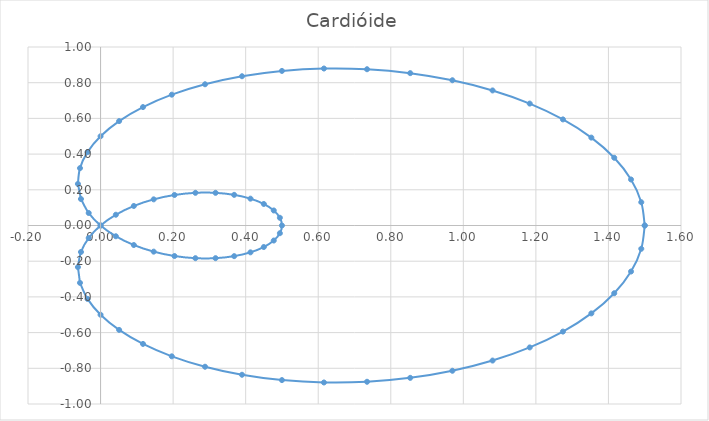
| Category | Series 0 |
|---|---|
| 1.5 | 0 |
| 1.4905012255519767 | 0.13 |
| 1.4622501868990583 | 0.258 |
| 1.4159756150367535 | 0.379 |
| 1.3528685319524434 | 0.492 |
| 1.2745476983615946 | 0.594 |
| 1.1830127018922196 | 0.683 |
| 1.0805860938073304 | 0.757 |
| 0.9698463103929541 | 0.814 |
| 0.8535533905932737 | 0.854 |
| 0.7345697160098045 | 0.875 |
| 0.6157781465126887 | 0.879 |
| 0.5000000000000001 | 0.866 |
| 0.38991532602708007 | 0.836 |
| 0.2879878501033455 | 0.791 |
| 0.19639682065904104 | 0.733 |
| 0.11697777844051103 | 0.663 |
| 0.05117399486772503 | 0.585 |
| 3.0628711372715506e-17 | 0.5 |
| -0.035981747879933135 | 0.411 |
| -0.05667039922641936 | 0.321 |
| -0.0624222244434797 | 0.233 |
| -0.05403229322232339 | 0.148 |
| -0.032702935713619416 | 0.07 |
| -1.110223024625156e-16 | 0 |
| 0.04220171016164241 | -0.06 |
| 0.0917821063232652 | -0.109 |
| 0.14644660940672619 | -0.146 |
| 0.203801867273976 | -0.171 |
| 0.2614340495183382 | -0.183 |
| 0.31698729810778076 | -0.183 |
| 0.36823991132494466 | -0.172 |
| 0.41317591116653474 | -0.15 |
| 0.45004978874768503 | -0.121 |
| 0.4774424338868501 | -0.084 |
| 0.4943065274602313 | -0.043 |
| 0.5 | 0 |
| 0.4943065274602313 | 0.043 |
| 0.4774424338868501 | 0.084 |
| 0.45004978874768536 | 0.121 |
| 0.4131759111665349 | 0.15 |
| 0.36823991132494477 | 0.172 |
| 0.3169872981077806 | 0.183 |
| 0.2614340495183387 | 0.183 |
| 0.20380186727397614 | 0.171 |
| 0.14644660940672638 | 0.146 |
| 0.09178210632326528 | 0.109 |
| 0.04220171016164277 | 0.06 |
| 2.220446049250315e-16 | 0 |
| -0.03270293571361921 | -0.07 |
| -0.054032293222323266 | -0.148 |
| -0.06242222444347971 | -0.233 |
| -0.056670399226419366 | -0.321 |
| -0.03598174787993314 | -0.411 |
| -9.188613411814648e-17 | -0.5 |
| 0.051173994867724865 | -0.585 |
| 0.11697777844051066 | -0.663 |
| 0.19639682065904143 | -0.733 |
| 0.2879878501033447 | -0.791 |
| 0.3899153260270803 | -0.836 |
| 0.5000000000000001 | -0.866 |
| 0.6157781465126886 | -0.879 |
| 0.7345697160098044 | -0.875 |
| 0.8535533905932735 | -0.854 |
| 0.9698463103929538 | -0.814 |
| 1.0805860938073297 | -0.757 |
| 1.1830127018922187 | -0.683 |
| 1.274547698361594 | -0.594 |
| 1.3528685319524434 | -0.492 |
| 1.4159756150367535 | -0.379 |
| 1.4622501868990578 | -0.258 |
| 1.4905012255519767 | -0.13 |
| 1.5 | 0 |